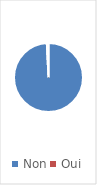
| Category | Series 0 |
|---|---|
| Non | 0.992 |
| Oui | 0.008 |